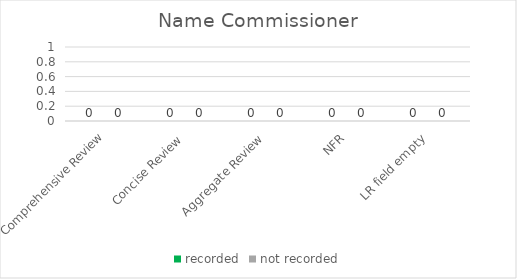
| Category | recorded | not recorded |
|---|---|---|
| Comprehensive Review | 0 | 0 |
| Concise Review | 0 | 0 |
| Aggregate Review | 0 | 0 |
| NFR | 0 | 0 |
| LR field empty | 0 | 0 |